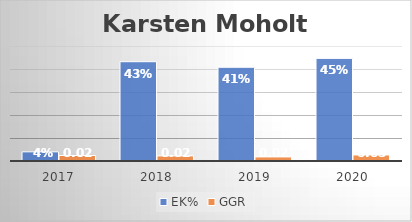
| Category | EK% | GGR |
|---|---|---|
| 2017.0 | 0.04 | 0.024 |
| 2018.0 | 0.432 | 0.022 |
| 2019.0 | 0.407 | 0.018 |
| 2020.0 | 0.446 | 0.026 |